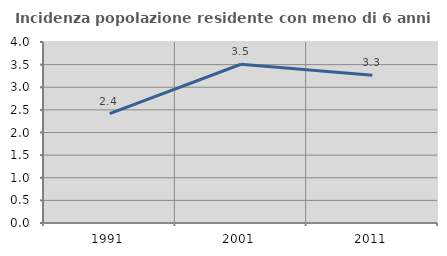
| Category | Incidenza popolazione residente con meno di 6 anni |
|---|---|
| 1991.0 | 2.416 |
| 2001.0 | 3.509 |
| 2011.0 | 3.266 |